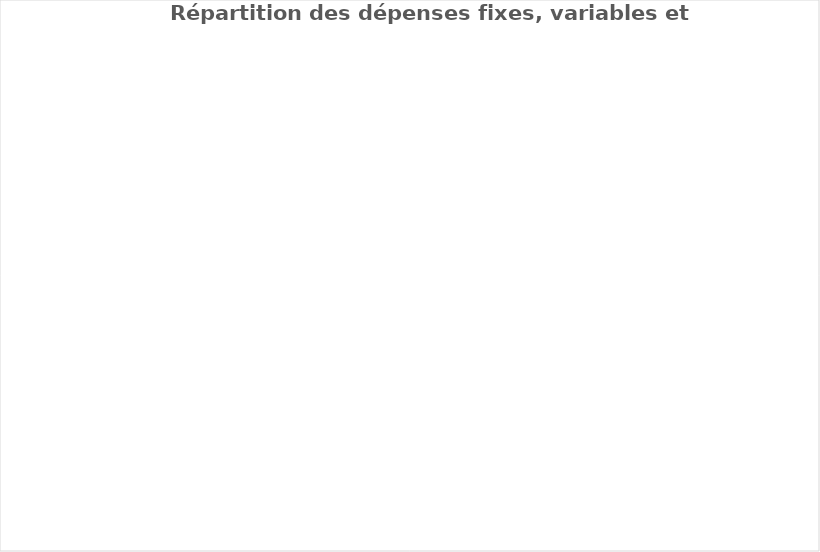
| Category | Series 0 |
|---|---|
| Habitation | 0 |
| Transport | 0 |
| Frais et assurances | 0 |
| Personnes à charge | 0 |
| Alimentation | 0 |
| Vêtements | 0 |
| Loisirs | 0 |
| Études | 0 |
| Soins personnels | 0 |
| Soins médicaux | 0 |
| Animaux | 0 |
| Dons et cadeaux | 0 |
| Cartes de crédit (Visa, Mastercard, Magasins) | 0 |
| Prêts | 0 |
| Gouvernements | 0 |
| Comptes (Bell, Hydro-Québec, Gaz, Vidéotron) | 0 |
| Autres dettes | 0 |